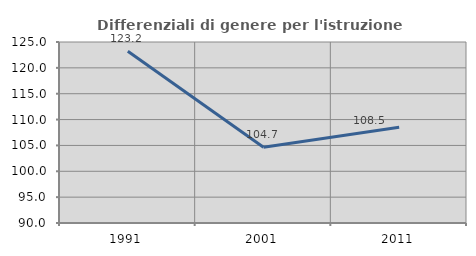
| Category | Differenziali di genere per l'istruzione superiore |
|---|---|
| 1991.0 | 123.2 |
| 2001.0 | 104.651 |
| 2011.0 | 108.511 |